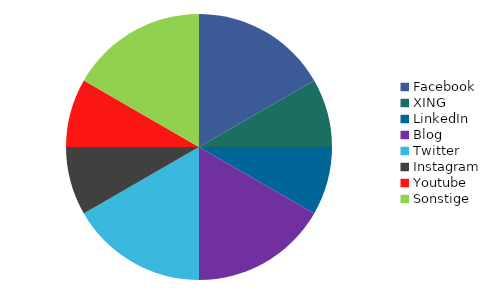
| Category | Series 0 |
|---|---|
| Facebook | 2 |
| XING | 1 |
| LinkedIn | 1 |
| Blog | 2 |
| Twitter | 2 |
| Instagram | 1 |
| Youtube | 1 |
| Sonstige | 2 |